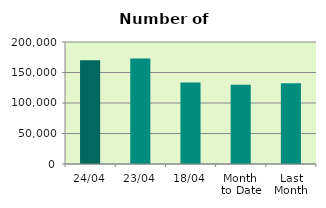
| Category | Series 0 |
|---|---|
| 24/04 | 170056 |
| 23/04 | 173094 |
| 18/04 | 133528 |
| Month 
to Date | 129921.875 |
| Last
Month | 132498.571 |